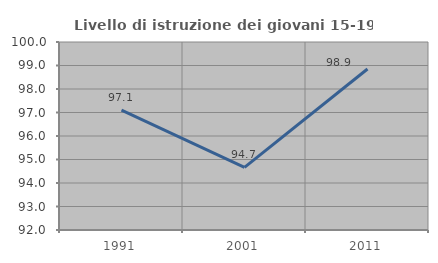
| Category | Livello di istruzione dei giovani 15-19 anni |
|---|---|
| 1991.0 | 97.101 |
| 2001.0 | 94.667 |
| 2011.0 | 98.851 |